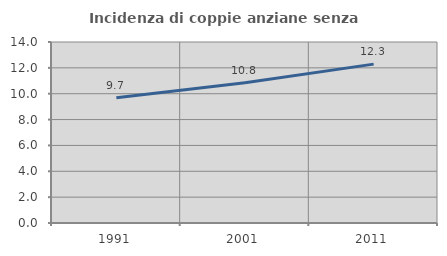
| Category | Incidenza di coppie anziane senza figli  |
|---|---|
| 1991.0 | 9.68 |
| 2001.0 | 10.842 |
| 2011.0 | 12.289 |